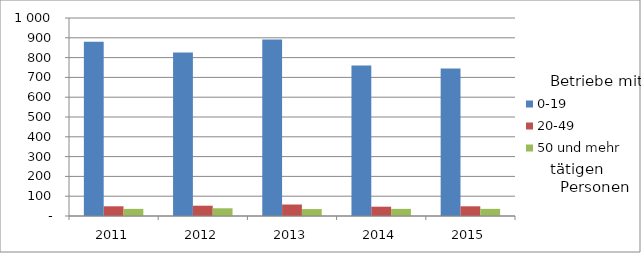
| Category | 0-19 | 20-49 | 50 und mehr |
|---|---|---|---|
| 2011.0 | 880 | 49 | 36 |
| 2012.0 | 826 | 52 | 39 |
| 2013.0 | 891 | 58 | 35 |
| 2014.0 | 760 | 47 | 36 |
| 2015.0 | 745 | 49 | 36 |